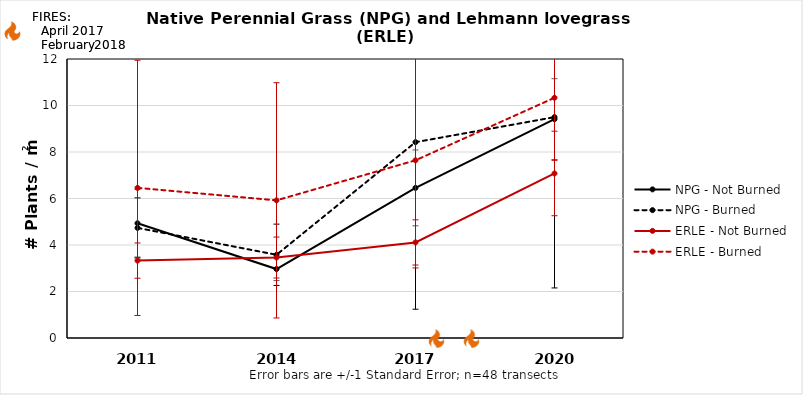
| Category | NPG - Not Burned | NPG - Burned | ERLE - Not Burned | ERLE - Burned |
|---|---|---|---|---|
| 2011.0 | 4.933 | 4.736 | 3.329 | 6.458 |
| 2014.0 | 2.965 | 3.579 | 3.461 | 5.92 |
| 2017.0 | 6.457 | 8.423 | 4.111 | 7.642 |
| 2020.0 | 9.413 | 9.499 | 7.077 | 10.333 |